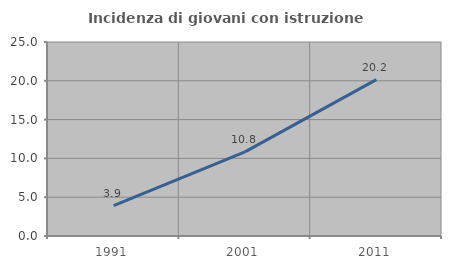
| Category | Incidenza di giovani con istruzione universitaria |
|---|---|
| 1991.0 | 3.922 |
| 2001.0 | 10.843 |
| 2011.0 | 20.155 |